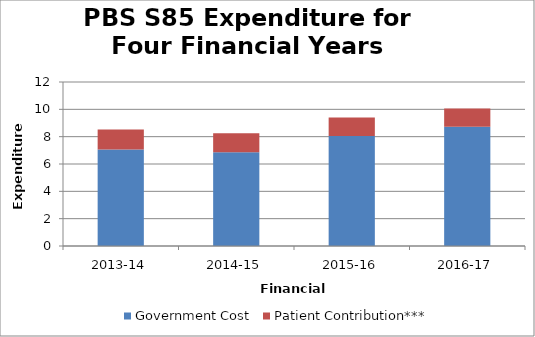
| Category | Government Cost | Patient Contribution*** |
|---|---|---|
| 2013-14 | 7069175633.29 | 1458891918.9 |
| 2014-15 | 6851505025.88 | 1404249150 |
| 2015-16 | 8047523775.59 | 1362141426 |
| 2016-17 | 8729215722.88 | 1340895989.9 |